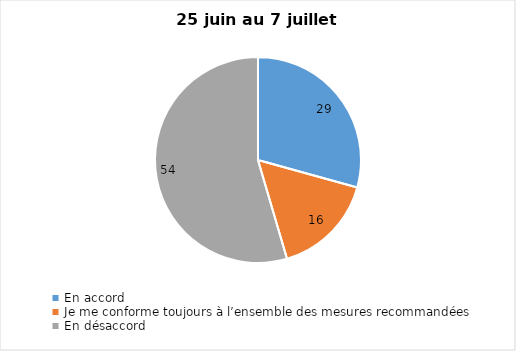
| Category | Series 0 |
|---|---|
| En accord | 29 |
| Je me conforme toujours à l’ensemble des mesures recommandées | 16 |
| En désaccord | 54 |